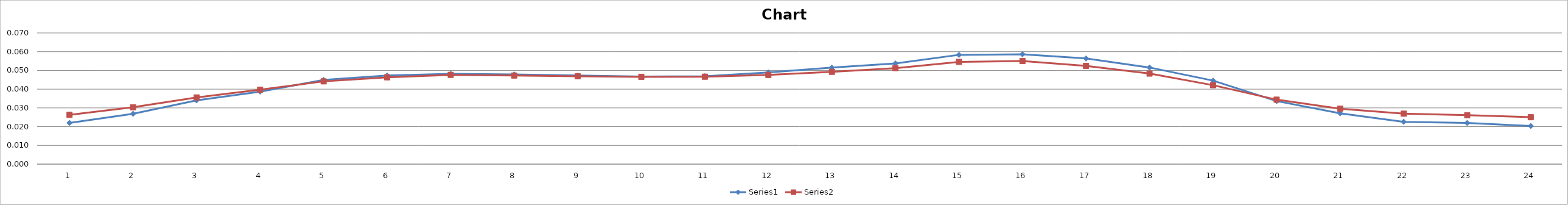
| Category | Series 0 | Series 1 |
|---|---|---|
| 0 | 0.022 | 0.026 |
| 1 | 0.027 | 0.03 |
| 2 | 0.034 | 0.036 |
| 3 | 0.039 | 0.04 |
| 4 | 0.045 | 0.044 |
| 5 | 0.047 | 0.046 |
| 6 | 0.048 | 0.048 |
| 7 | 0.048 | 0.047 |
| 8 | 0.047 | 0.047 |
| 9 | 0.047 | 0.047 |
| 10 | 0.047 | 0.047 |
| 11 | 0.049 | 0.048 |
| 12 | 0.052 | 0.049 |
| 13 | 0.054 | 0.051 |
| 14 | 0.058 | 0.055 |
| 15 | 0.059 | 0.055 |
| 16 | 0.056 | 0.052 |
| 17 | 0.052 | 0.048 |
| 18 | 0.045 | 0.042 |
| 19 | 0.034 | 0.034 |
| 20 | 0.027 | 0.03 |
| 21 | 0.023 | 0.027 |
| 22 | 0.022 | 0.026 |
| 23 | 0.02 | 0.025 |